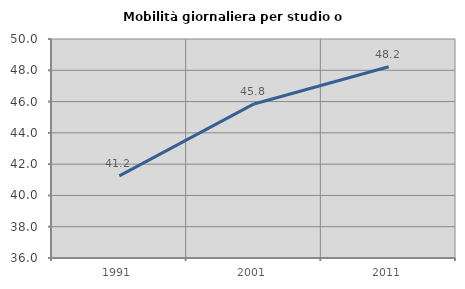
| Category | Mobilità giornaliera per studio o lavoro |
|---|---|
| 1991.0 | 41.246 |
| 2001.0 | 45.848 |
| 2011.0 | 48.23 |